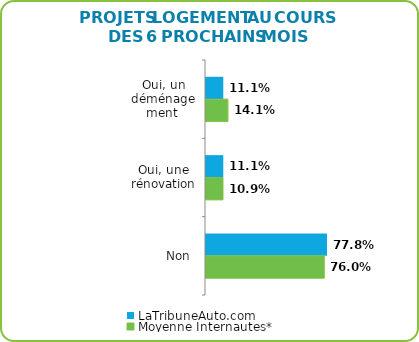
| Category | LaTribuneAuto.com | Moyenne Internautes* |
|---|---|---|
| Oui, un déménagement  | 0.111 | 0.141 |
| Oui, une rénovation | 0.111 | 0.109 |
| Non  | 0.778 | 0.76 |